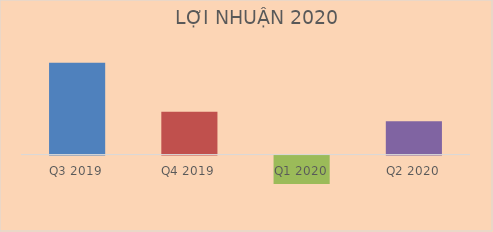
| Category | Doanh thu thuần |
|---|---|
| Q3 2019 | 2112525045798 |
| Q4 2019 | 985084855887 |
| Q1 2020 | -657167336637 |
| Q2 2020 | 769560577627 |